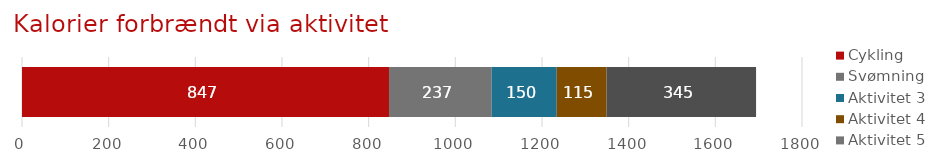
| Category | Cykling | Svømning | Aktivitet 3 | Aktivitet 4 | Aktivitet 5 |
|---|---|---|---|---|---|
| Aktivitetsregister | 847 | 237 | 150 | 115 | 345 |